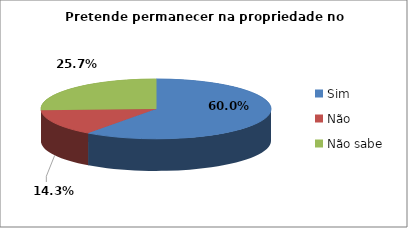
| Category | Series 0 |
|---|---|
| Sim | 21 |
| Não | 5 |
| Não sabe | 9 |